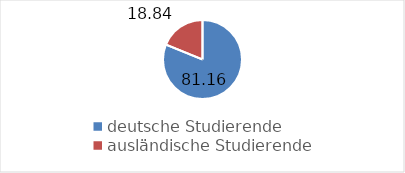
| Category | Series 0 |
|---|---|
| deutsche Studierende | 81.156 |
| ausländische Studierende | 18.844 |